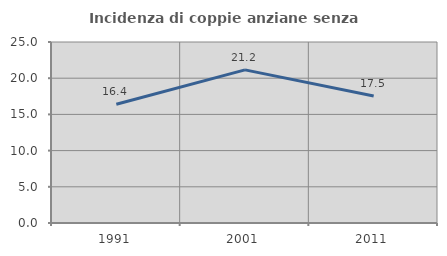
| Category | Incidenza di coppie anziane senza figli  |
|---|---|
| 1991.0 | 16.393 |
| 2001.0 | 21.154 |
| 2011.0 | 17.544 |